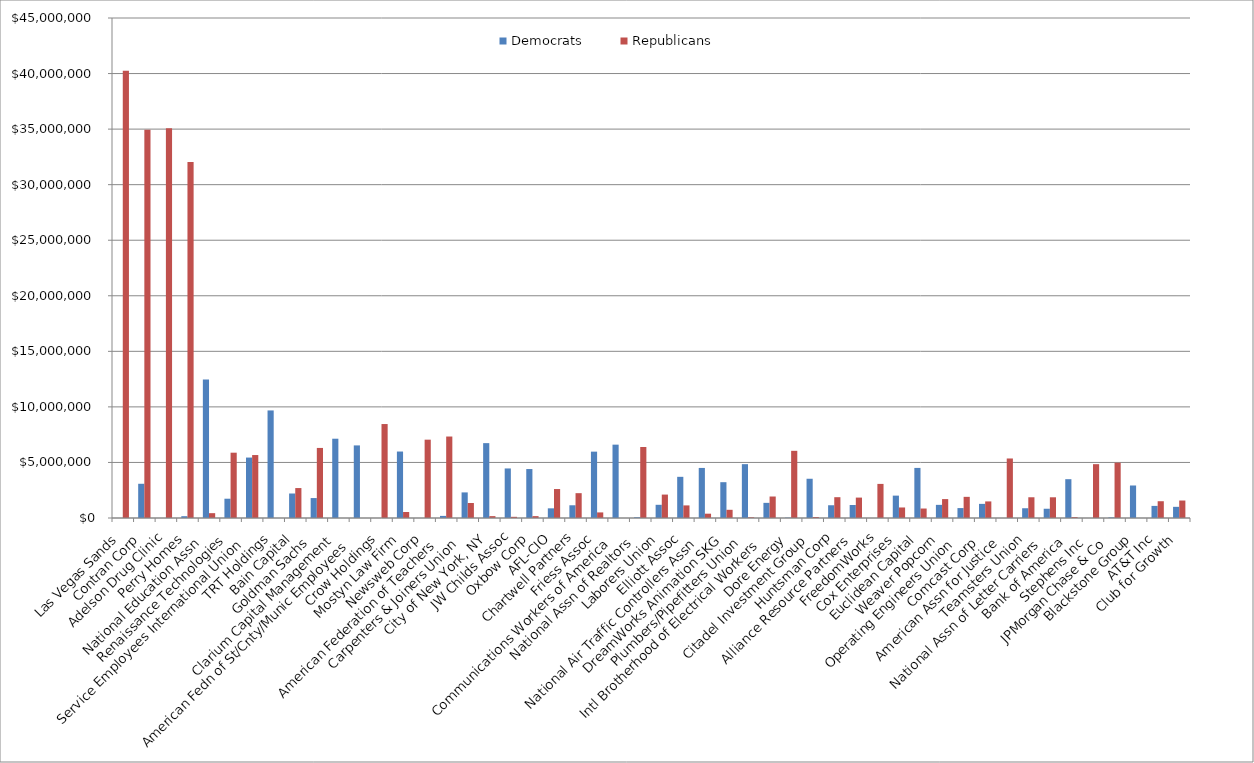
| Category | Democrats | Republicans |
|---|---|---|
| Las Vegas Sands | 0 | 40262550 |
| Contran Corp | 3079877.44 | 34934356.56 |
| Adelson Drug Clinic | 0 | 35081600 |
| Perry Homes | 162097 | 32047603 |
| National Education Assn  | 12465445.84 | 436040.16 |
| Renaissance Technologies | 1736002 | 5877806 |
| Service Employees International Union  | 5439333.5 | 5666316.5 |
| TRT Holdings | 9680480 | 0 |
| Bain Capital | 2205211.05 | 2695257.95 |
| Goldman Sachs  | 1794722.37 | 6305878.63 |
| Clarium Capital Management | 7135437 | 0 |
| American Fedn of St/Cnty/Munic Employees  | 6533144 | 0 |
| Crow Holdings | 0 | 8456600 |
| Mostyn Law Firm | 5981672 | 538928 |
| Newsweb Corp  | 0 | 7049700.5 |
| American Federation of Teachers  | 189360 | 7332840 |
| Carpenters & Joiners Union  | 2303539.42 | 1351844.58 |
| City of New York, NY | 6737758.59 | 168932.41 |
| JW Childs Assoc | 4459744.48 | 106538.52 |
| Oxbow Corp | 4407261.75 | 168803.25 |
| AFL-CIO  | 870326.42 | 2606575.58 |
| Chartwell Partners | 1145582.89 | 2235421.11 |
| Friess Assoc | 5971935.8 | 503170.2 |
| Communications Workers of America  | 6601500 | 0 |
| National Assn of Realtors  | 66425 | 6389825 |
| Laborers Union  | 1187827.48 | 2107991.92 |
| Elliott Assoc | 3705558 | 1133762 |
| National Air Traffic Controllers Assn  | 4505791.86 | 388409.52 |
| DreamWorks Animation SKG | 3223267.49 | 738161.51 |
| Plumbers/Pipefitters Union  | 4846152.94 | 62371.06 |
| Intl Brotherhood of Electrical Workers  | 1362756.56 | 1934417.44 |
| Dore Energy | 30767 | 6045933 |
| Citadel Investment Group | 3532114.22 | 91611.78 |
| Huntsman Corp | 1147797.22 | 1872721.78 |
| Alliance Resource Partners | 1171521 | 1836879 |
| FreedomWorks | 0 | 3068555 |
| Cox Enterprises | 2013982.1 | 947615.9 |
| Euclidean Capital | 4507464.81 | 852603.19 |
| Weaver Popcorn | 1182747.5 | 1702002.5 |
| Operating Engineers Union  | 893181.76 | 1904111.24 |
| Comcast Corp  | 1271315.8 | 1492414.2 |
| American Assn for Justice  | 0 | 5356500 |
| Teamsters Union  | 878114.24 | 1866653.76 |
| National Assn of Letter Carriers  | 833072.51 | 1863548.49 |
| Bank of America  | 3493663.95 | 80371.05 |
| Stephens Inc  | 0 | 4844682 |
| JPMorgan Chase & Co  | 52412.78 | 4978226.22 |
| Blackstone Group | 2926176 | 0 |
| AT&T Inc  | 1089476.64 | 1509715.36 |
| Club for Growth  | 1004927.76 | 1572656.24 |